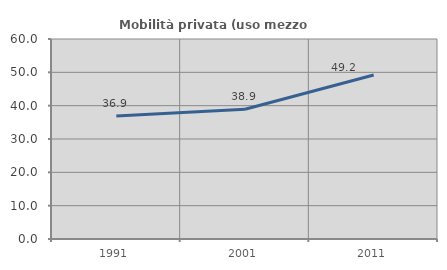
| Category | Mobilità privata (uso mezzo privato) |
|---|---|
| 1991.0 | 36.92 |
| 2001.0 | 38.947 |
| 2011.0 | 49.206 |